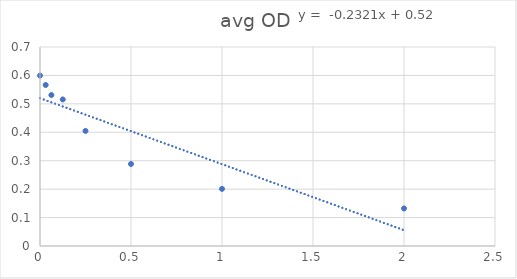
| Category | avg OD |
|---|---|
| 0.0 | 0.599 |
| 0.03125 | 0.566 |
| 0.0625 | 0.531 |
| 0.125 | 0.516 |
| 0.25 | 0.405 |
| 0.5 | 0.289 |
| 1.0 | 0.201 |
| 2.0 | 0.132 |